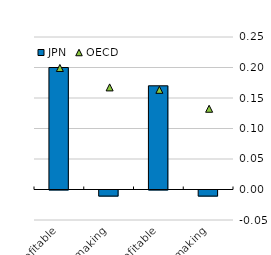
| Category | JPN |
|---|---|
| Profitable | 0.2 |
| Loss-making | -0.01 |
| Profitable | 0.17 |
| Loss-making | -0.01 |